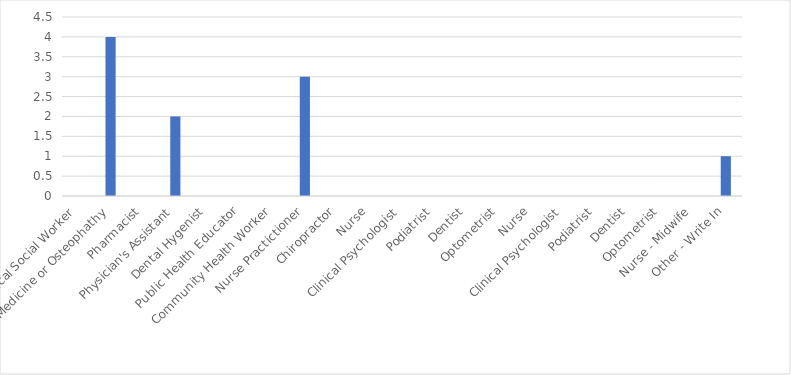
| Category | Number of Responses |
|---|---|
| Clinical Social Worker | 0 |
| Doctor of Medicine or Osteophathy | 4 |
| Pharmacist | 0 |
| Physician's Assistant | 2 |
| Dental Hygenist | 0 |
| Public Health Educator | 0 |
| Community Health Worker | 0 |
| Nurse Practictioner | 3 |
| Chiropractor | 0 |
| Nurse | 0 |
| Clinical Psychologist | 0 |
| Podiatrist | 0 |
| Dentist | 0 |
| Optometrist | 0 |
| Nurse | 0 |
| Clinical Psychologist | 0 |
| Podiatrist | 0 |
| Dentist | 0 |
| Optometrist | 0 |
| Nurse - Midwife | 0 |
| Other - Write In | 1 |